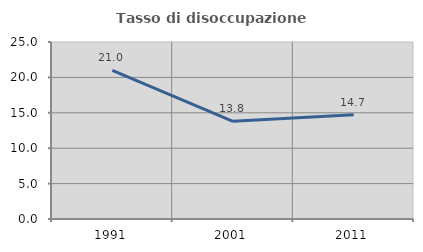
| Category | Tasso di disoccupazione giovanile  |
|---|---|
| 1991.0 | 20.992 |
| 2001.0 | 13.793 |
| 2011.0 | 14.732 |